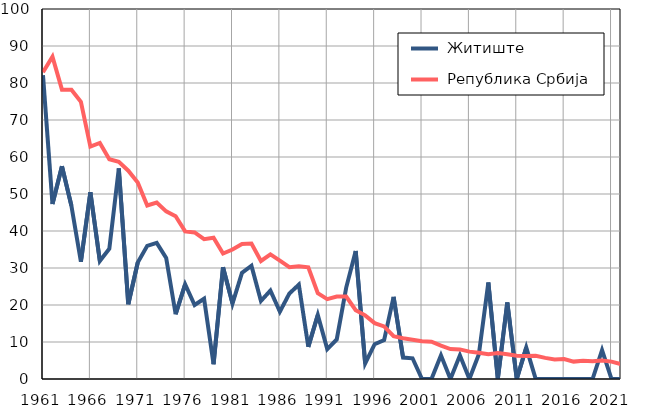
| Category |  Житиште |  Република Србија |
|---|---|---|
| 1961.0 | 82.1 | 82.9 |
| 1962.0 | 47.3 | 87.1 |
| 1963.0 | 57.5 | 78.2 |
| 1964.0 | 46.8 | 78.2 |
| 1965.0 | 31.7 | 74.9 |
| 1966.0 | 50.5 | 62.8 |
| 1967.0 | 31.9 | 63.8 |
| 1968.0 | 35.2 | 59.4 |
| 1969.0 | 56.9 | 58.7 |
| 1970.0 | 20.2 | 56.3 |
| 1971.0 | 31.5 | 53.1 |
| 1972.0 | 36 | 46.9 |
| 1973.0 | 36.8 | 47.7 |
| 1974.0 | 32.7 | 45.3 |
| 1975.0 | 17.5 | 44 |
| 1976.0 | 25.6 | 39.9 |
| 1977.0 | 20 | 39.6 |
| 1978.0 | 21.7 | 37.8 |
| 1979.0 | 4 | 38.2 |
| 1980.0 | 30.2 | 33.9 |
| 1981.0 | 20.4 | 35 |
| 1982.0 | 28.7 | 36.5 |
| 1983.0 | 30.6 | 36.6 |
| 1984.0 | 21.1 | 31.9 |
| 1985.0 | 23.9 | 33.7 |
| 1986.0 | 18.2 | 32 |
| 1987.0 | 23.1 | 30.2 |
| 1988.0 | 25.5 | 30.5 |
| 1989.0 | 8.7 | 30.2 |
| 1990.0 | 17.3 | 23.2 |
| 1991.0 | 8.1 | 21.6 |
| 1992.0 | 10.7 | 22.3 |
| 1993.0 | 24.7 | 22.3 |
| 1994.0 | 34.6 | 18.6 |
| 1995.0 | 4.2 | 17.2 |
| 1996.0 | 9.4 | 15.1 |
| 1997.0 | 10.5 | 14.2 |
| 1998.0 | 22.2 | 11.6 |
| 1999.0 | 5.8 | 11 |
| 2000.0 | 5.6 | 10.6 |
| 2001.0 | 0 | 10.2 |
| 2002.0 | 0 | 10.1 |
| 2003.0 | 6.4 | 9 |
| 2004.0 | 0 | 8.1 |
| 2005.0 | 6.4 | 8 |
| 2006.0 | 0 | 7.4 |
| 2007.0 | 6.7 | 7.1 |
| 2008.0 | 26.1 | 6.7 |
| 2009.0 | 0 | 7 |
| 2010.0 | 20.7 | 6.7 |
| 2011.0 | 0 | 6.3 |
| 2012.0 | 8.5 | 6.2 |
| 2013.0 | 0 | 6.3 |
| 2014.0 | 0 | 5.7 |
| 2015.0 | 0 | 5.3 |
| 2016.0 | 0 | 5.4 |
| 2017.0 | 0 | 4.7 |
| 2018.0 | 0 | 4.9 |
| 2019.0 | 0 | 4.8 |
| 2020.0 | 7.8 | 5 |
| 2021.0 | 0 | 4.7 |
| 2022.0 | 0 | 4 |